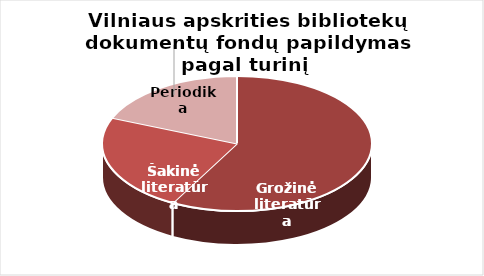
| Category | Series 0 |
|---|---|
| Grožinė literatūra | 61645 |
| Šakinė literatūra | 24833 |
| Periodika | 19990 |